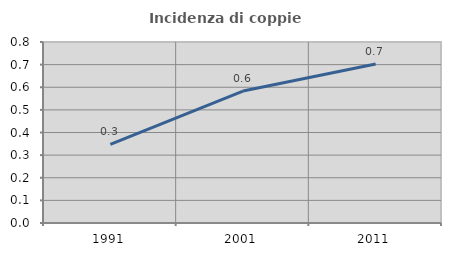
| Category | Incidenza di coppie miste |
|---|---|
| 1991.0 | 0.348 |
| 2001.0 | 0.583 |
| 2011.0 | 0.702 |